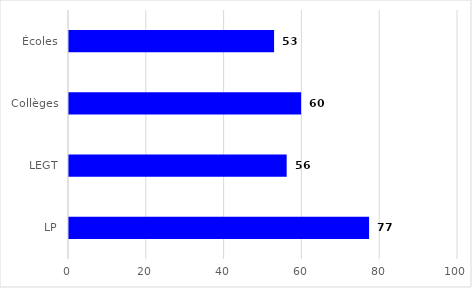
| Category | Series 0 |
|---|---|
| Écoles | 52.72 |
| Collèges | 59.663 |
| LEGT | 55.955 |
| LP | 77.14 |